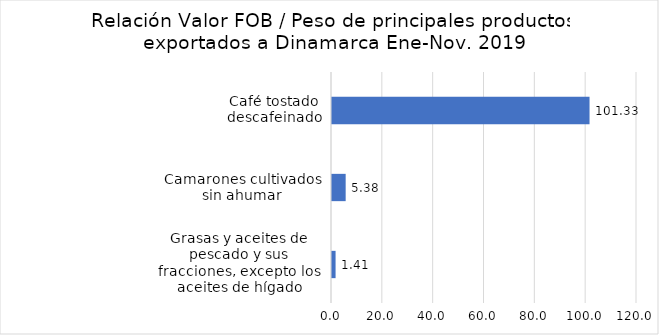
| Category | Series 0 |
|---|---|
| Grasas y aceites de pescado y sus fracciones, excepto los aceites de hígado | 1.408 |
| Camarones cultivados sin ahumar | 5.377 |
| Café tostado descafeinado | 101.326 |